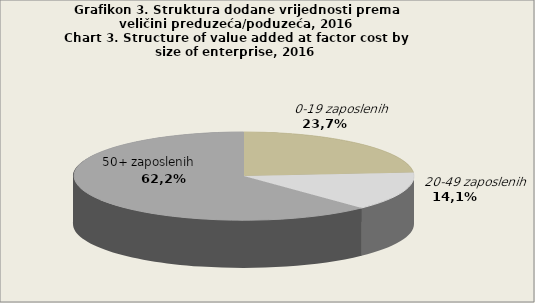
| Category | Series 0 |
|---|---|
| 0-19 zaposlenih | 2243392315 |
| 20-49 zaposlenih | 1334359662 |
| 50+ zaposlenih | 5875082970 |